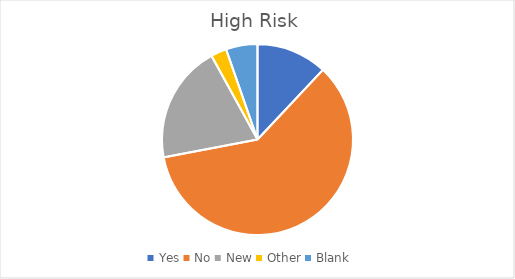
| Category | Series 0 |
|---|---|
| Yes | 9 |
| No | 45 |
| New | 15 |
| Other | 2 |
| Blank | 4 |